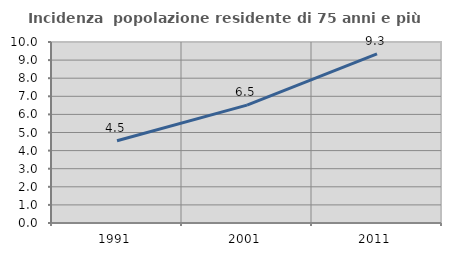
| Category | Incidenza  popolazione residente di 75 anni e più |
|---|---|
| 1991.0 | 4.545 |
| 2001.0 | 6.512 |
| 2011.0 | 9.345 |